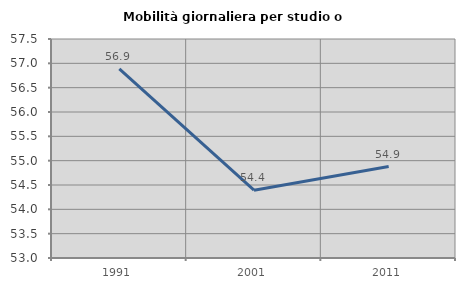
| Category | Mobilità giornaliera per studio o lavoro |
|---|---|
| 1991.0 | 56.887 |
| 2001.0 | 54.394 |
| 2011.0 | 54.879 |